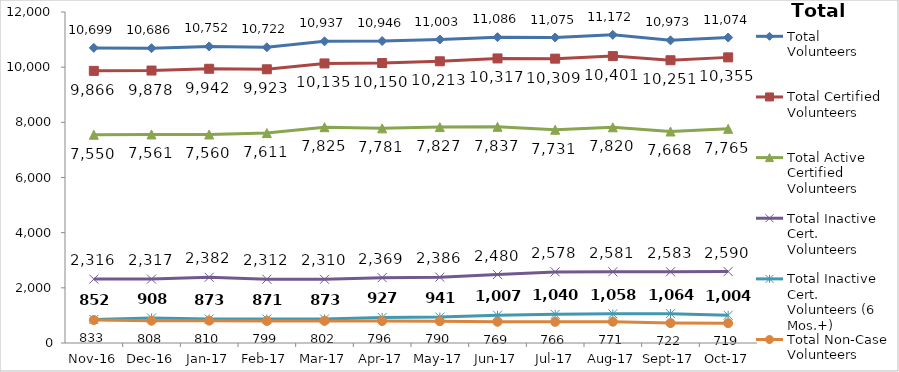
| Category | Total Volunteers | Total Certified Volunteers | Total Active Certified Volunteers | Total Inactive Cert. Volunteers | Total Inactive Cert. Volunteers (6 Mos.+) | Total Non-Case Volunteers |
|---|---|---|---|---|---|---|
| 2016-11-01 | 10699 | 9866 | 7550 | 2316 | 852 | 833 |
| 2016-12-01 | 10686 | 9878 | 7561 | 2317 | 908 | 808 |
| 2017-01-01 | 10752 | 9942 | 7560 | 2382 | 873 | 810 |
| 2017-02-01 | 10722 | 9923 | 7611 | 2312 | 871 | 799 |
| 2017-03-01 | 10937 | 10135 | 7825 | 2310 | 873 | 802 |
| 2017-04-01 | 10946 | 10150 | 7781 | 2369 | 927 | 796 |
| 2017-05-01 | 11003 | 10213 | 7827 | 2386 | 941 | 790 |
| 2017-06-01 | 11086 | 10317 | 7837 | 2480 | 1007 | 769 |
| 2017-07-01 | 11075 | 10309 | 7731 | 2578 | 1040 | 766 |
| 2017-08-01 | 11172 | 10401 | 7820 | 2581 | 1058 | 771 |
| 2017-09-01 | 10973 | 10251 | 7668 | 2583 | 1064 | 722 |
| 2017-10-01 | 11074 | 10355 | 7765 | 2590 | 1004 | 719 |